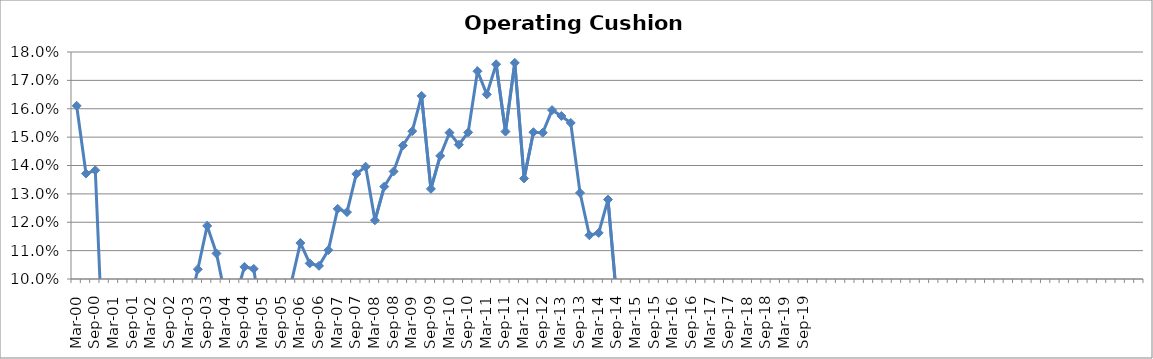
| Category | Operating Cushion % |
|---|---|
| Mar-00 | 0.161 |
| Jun-00 | 0.137 |
| Sep-00 | 0.138 |
| Dec-00 | 0.061 |
| Mar-01 | -0.007 |
| Jun-01 | -0.159 |
| Sep-01 | -0.094 |
| Dec-01 | -0.053 |
| Mar-02 | -0.009 |
| Jun-02 | 0.004 |
| Sep-02 | 0.066 |
| Dec-02 | 0.067 |
| Mar-03 | 0.089 |
| Jun-03 | 0.103 |
| Sep-03 | 0.119 |
| Dec-03 | 0.109 |
| Mar-04 | 0.093 |
| Jun-04 | 0.093 |
| Sep-04 | 0.104 |
| Dec-04 | 0.104 |
| Mar-05 | 0.081 |
| Jun-05 | 0.084 |
| Sep-05 | 0.084 |
| Dec-05 | 0.098 |
| Mar-06 | 0.113 |
| Jun-06 | 0.106 |
| Sep-06 | 0.105 |
| Dec-06 | 0.11 |
| Mar-07 | 0.125 |
| Jun-07 | 0.124 |
| Sep-07 | 0.137 |
| Dec-07 | 0.14 |
| Mar-08 | 0.121 |
| Jun-08 | 0.133 |
| Sep-08 | 0.138 |
| Dec-08 | 0.147 |
| Mar-09 | 0.152 |
| Jun-09 | 0.165 |
| Sep-09 | 0.132 |
| Dec-09 | 0.143 |
| Mar-10 | 0.152 |
| Jun-10 | 0.147 |
| Sep-10 | 0.152 |
| Dec-10 | 0.173 |
| Mar-11 | 0.165 |
| Jun-11 | 0.176 |
| Sep-11 | 0.152 |
| Dec-11 | 0.176 |
| Mar-12 | 0.135 |
| Jun-12 | 0.152 |
| Sep-12 | 0.152 |
| Dec-12 | 0.16 |
| Mar-13 | 0.157 |
| Jun-13 | 0.155 |
| Sep-13 | 0.13 |
| Dec-13 | 0.115 |
| Mar-14 | 0.116 |
| Jun-14 | 0.128 |
| Sep-14 | 0.091 |
| Dec-14 | 0.04 |
| Mar-15 | 0.01 |
| Jun-15 | 0.027 |
| Sep-15 | -0.049 |
| Dec-15 | -0.134 |
| Mar-16 | -0.284 |
| Jun-16 | -0.23 |
| Sep-16 | -0.221 |
| Dec-16 | -0.24 |
| Mar-17 | -0.136 |
| Jun-17 | -0.214 |
| Sep-17 | -0.282 |
| Dec-17 | -0.37 |
| Mar-18 | -0.38 |
| Jun-18 | -0.455 |
| Sep-18 | -0.539 |
| Dec-18 | -0.71 |
| Mar-19 | -0.489 |
| Jun-19 | -0.735 |
| Sep-19 | -0.641 |